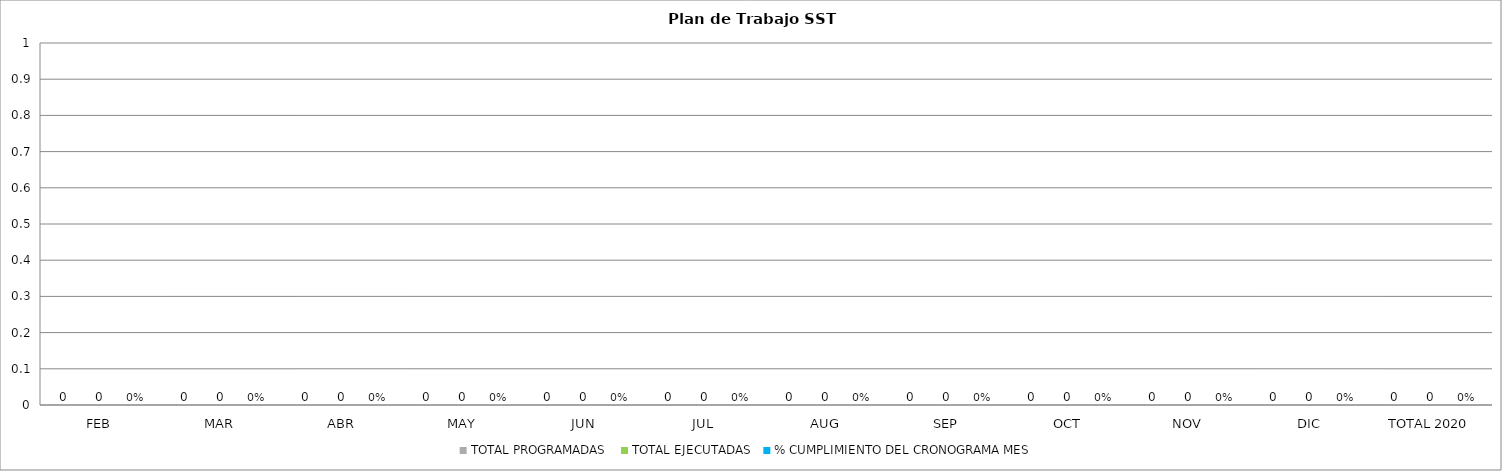
| Category | TOTAL PROGRAMADAS | TOTAL EJECUTADAS | % CUMPLIMIENTO DEL CRONOGRAMA MES |
|---|---|---|---|
| FEB | 0 | 0 | 0 |
| MAR | 0 | 0 | 0 |
| ABR | 0 | 0 | 0 |
| MAY | 0 | 0 | 0 |
| JUN | 0 | 0 | 0 |
| JUL | 0 | 0 | 0 |
| AUG | 0 | 0 | 0 |
| SEP | 0 | 0 | 0 |
| OCT | 0 | 0 | 0 |
| NOV | 0 | 0 | 0 |
| DIC | 0 | 0 | 0 |
| TOTAL 2020 | 0 | 0 | 0 |